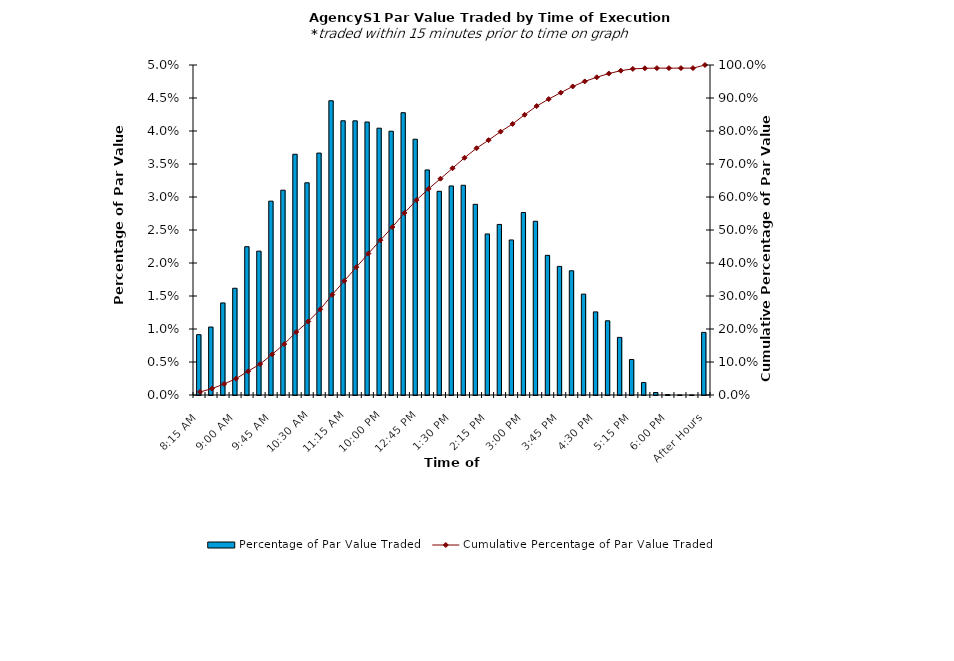
| Category | Percentage of Par Value Traded |
|---|---|
| 8:15 AM | 0.009 |
| 8:30 AM | 0.01 |
| 8:45 AM | 0.014 |
| 9:00 AM | 0.016 |
| 9:15 AM | 0.022 |
| 9:30 AM | 0.022 |
| 9:45 AM | 0.029 |
| 10:00 AM | 0.031 |
| 10:15 AM | 0.036 |
| 10:30 AM | 0.032 |
| 10:45 AM | 0.037 |
| 11:00 AM | 0.045 |
| 11:15 AM | 0.042 |
| 11:30 AM | 0.042 |
| 11:45 AM | 0.041 |
| 12:00 PM | 0.04 |
| 12:15 PM | 0.04 |
| 12:30 PM | 0.043 |
| 12:45 PM | 0.039 |
| 1:00 PM | 0.034 |
| 1:15 PM | 0.031 |
| 1:30 PM | 0.032 |
| 1:45 PM | 0.032 |
| 2:00 PM | 0.029 |
| 2:15 PM | 0.024 |
| 2:30 PM | 0.026 |
| 2:45 PM | 0.023 |
| 3:00 PM | 0.028 |
| 3:15 PM | 0.026 |
| 3:30 PM | 0.021 |
| 3:45 PM | 0.019 |
| 4:00 PM | 0.019 |
| 4:15 PM | 0.015 |
| 4:30 PM | 0.013 |
| 4:45 PM | 0.011 |
| 5:00 PM | 0.009 |
| 5:15 PM | 0.005 |
| 5:30 PM | 0.002 |
| 5:45 PM | 0 |
| 6:00 PM | 0 |
| 6:15 PM | 0 |
| 6:30 PM | 0 |
| After Hours | 0.009 |